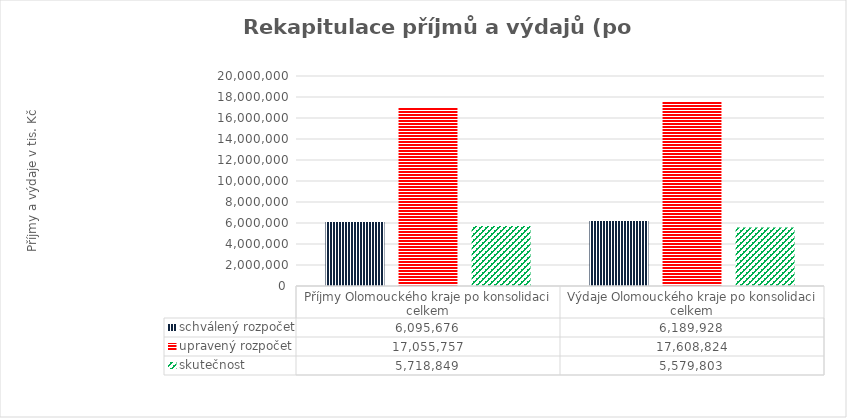
| Category | schválený rozpočet | upravený rozpočet | skutečnost |
|---|---|---|---|
| Příjmy Olomouckého kraje po konsolidaci celkem | 6095676 | 17055757 | 5718849 |
| Výdaje Olomouckého kraje po konsolidaci celkem | 6189928 | 17608824 | 5579803 |